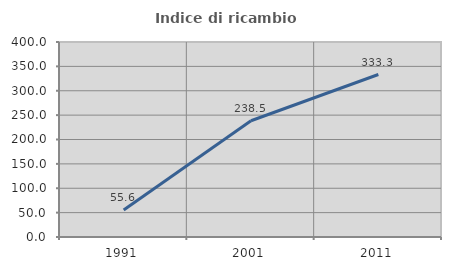
| Category | Indice di ricambio occupazionale  |
|---|---|
| 1991.0 | 55.556 |
| 2001.0 | 238.462 |
| 2011.0 | 333.333 |